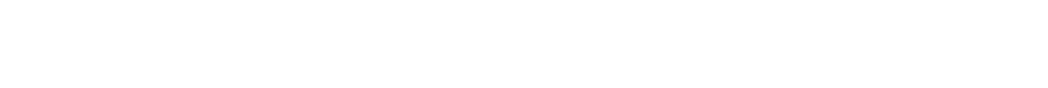
| Category | Series 6 |
|---|---|
| 0 | 0 |